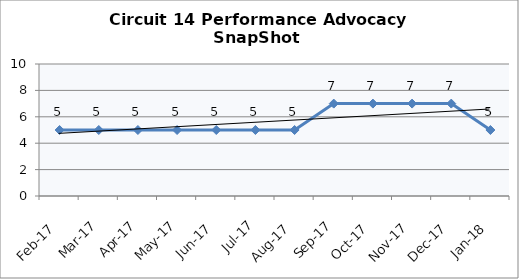
| Category | Circuit 14 |
|---|---|
| Feb-17 | 5 |
| Mar-17 | 5 |
| Apr-17 | 5 |
| May-17 | 5 |
| Jun-17 | 5 |
| Jul-17 | 5 |
| Aug-17 | 5 |
| Sep-17 | 7 |
| Oct-17 | 7 |
| Nov-17 | 7 |
| Dec-17 | 7 |
| Jan-18 | 5 |